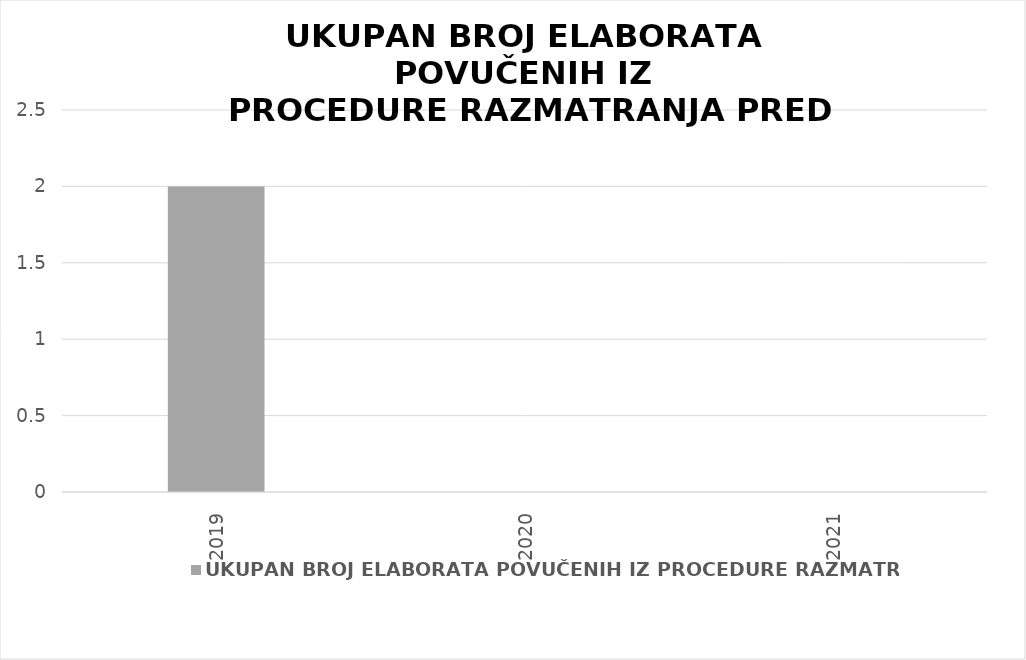
| Category | UKUPAN BROJ ELABORATA POVUČENIH IZ PROCEDURE RAZMATRANJA |
|---|---|
| 2019.0 | 2 |
| 2020.0 | 0 |
| 2021.0 | 0 |